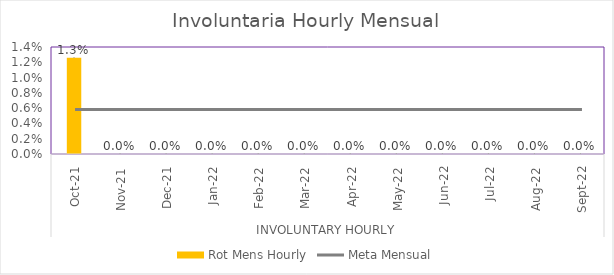
| Category | Series 5 | Rot Mens Hourly | Series 4 |
|---|---|---|---|
| 0 |  | 0.013 |  |
| 1 |  | 0 |  |
| 2 |  | 0 |  |
| 3 |  | 0 |  |
| 4 |  | 0 |  |
| 5 |  | 0 |  |
| 6 |  | 0 |  |
| 7 |  | 0 |  |
| 8 |  | 0 |  |
| 9 |  | 0 |  |
| 10 |  | 0 |  |
| 11 |  | 0 |  |